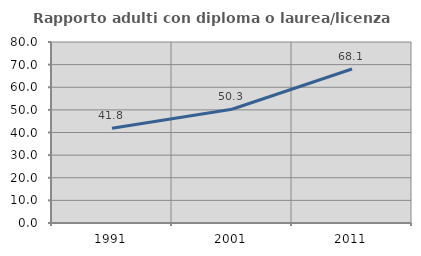
| Category | Rapporto adulti con diploma o laurea/licenza media  |
|---|---|
| 1991.0 | 41.844 |
| 2001.0 | 50.278 |
| 2011.0 | 68.074 |